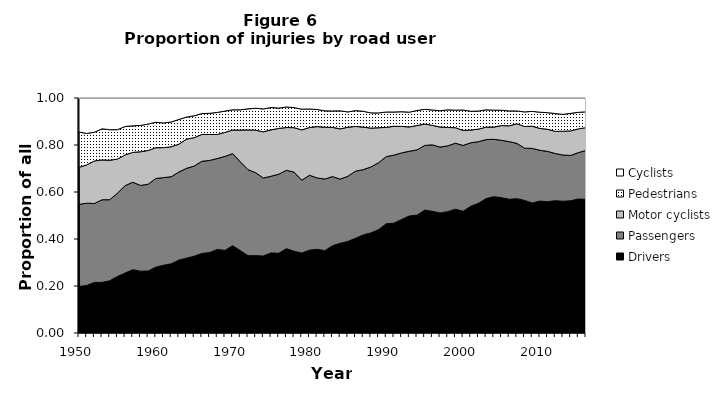
| Category | Drivers | Passengers | Motor cyclists | Pedestrians | Cyclists |
|---|---|---|---|---|---|
| 1950.0 | 0.198 | 0.349 | 0.158 | 0.15 | 0.145 |
| 1951.0 | 0.202 | 0.35 | 0.163 | 0.134 | 0.151 |
| 1952.0 | 0.215 | 0.336 | 0.181 | 0.122 | 0.146 |
| 1953.0 | 0.215 | 0.352 | 0.169 | 0.133 | 0.131 |
| 1954.0 | 0.222 | 0.345 | 0.168 | 0.13 | 0.135 |
| 1955.0 | 0.24 | 0.355 | 0.145 | 0.125 | 0.135 |
| 1956.0 | 0.255 | 0.372 | 0.131 | 0.121 | 0.121 |
| 1957.0 | 0.269 | 0.372 | 0.127 | 0.113 | 0.118 |
| 1958.0 | 0.263 | 0.365 | 0.143 | 0.112 | 0.117 |
| 1959.0 | 0.264 | 0.369 | 0.143 | 0.113 | 0.111 |
| 1960.0 | 0.28 | 0.377 | 0.131 | 0.108 | 0.103 |
| 1961.0 | 0.288 | 0.373 | 0.128 | 0.105 | 0.106 |
| 1962.0 | 0.294 | 0.371 | 0.127 | 0.105 | 0.102 |
| 1963.0 | 0.31 | 0.375 | 0.119 | 0.105 | 0.091 |
| 1964.0 | 0.318 | 0.382 | 0.124 | 0.094 | 0.081 |
| 1965.0 | 0.327 | 0.384 | 0.121 | 0.093 | 0.076 |
| 1966.0 | 0.339 | 0.392 | 0.114 | 0.089 | 0.066 |
| 1967.0 | 0.342 | 0.392 | 0.11 | 0.09 | 0.065 |
| 1968.0 | 0.356 | 0.387 | 0.102 | 0.094 | 0.061 |
| 1969.0 | 0.351 | 0.4 | 0.102 | 0.091 | 0.056 |
| 1970.0 | 0.372 | 0.392 | 0.1 | 0.086 | 0.05 |
| 1971.0 | 0.351 | 0.378 | 0.135 | 0.086 | 0.05 |
| 1972.0 | 0.329 | 0.366 | 0.169 | 0.09 | 0.046 |
| 1973.0 | 0.329 | 0.353 | 0.181 | 0.093 | 0.044 |
| 1974.0 | 0.328 | 0.332 | 0.197 | 0.097 | 0.047 |
| 1975.0 | 0.341 | 0.326 | 0.197 | 0.095 | 0.041 |
| 1976.0 | 0.339 | 0.336 | 0.195 | 0.086 | 0.043 |
| 1977.0 | 0.359 | 0.334 | 0.182 | 0.087 | 0.038 |
| 1978.0 | 0.348 | 0.337 | 0.189 | 0.085 | 0.041 |
| 1979.0 | 0.34 | 0.31 | 0.214 | 0.088 | 0.047 |
| 1980.0 | 0.353 | 0.319 | 0.203 | 0.079 | 0.047 |
| 1981.0 | 0.356 | 0.304 | 0.218 | 0.073 | 0.049 |
| 1982.0 | 0.35 | 0.305 | 0.22 | 0.07 | 0.055 |
| 1983.0 | 0.371 | 0.294 | 0.209 | 0.07 | 0.055 |
| 1984.0 | 0.382 | 0.273 | 0.214 | 0.077 | 0.055 |
| 1985.0 | 0.39 | 0.277 | 0.209 | 0.065 | 0.059 |
| 1986.0 | 0.403 | 0.285 | 0.191 | 0.067 | 0.054 |
| 1987.0 | 0.417 | 0.278 | 0.181 | 0.067 | 0.057 |
| 1988.0 | 0.426 | 0.281 | 0.165 | 0.065 | 0.063 |
| 1989.0 | 0.44 | 0.285 | 0.149 | 0.063 | 0.064 |
| 1990.0 | 0.465 | 0.285 | 0.124 | 0.066 | 0.059 |
| 1991.0 | 0.467 | 0.29 | 0.123 | 0.061 | 0.06 |
| 1992.0 | 0.483 | 0.283 | 0.113 | 0.062 | 0.058 |
| 1993.0 | 0.498 | 0.276 | 0.103 | 0.063 | 0.06 |
| 1994.0 | 0.502 | 0.278 | 0.104 | 0.064 | 0.053 |
| 1995.0 | 0.523 | 0.275 | 0.091 | 0.062 | 0.048 |
| 1996.0 | 0.518 | 0.283 | 0.083 | 0.066 | 0.051 |
| 1997.0 | 0.511 | 0.28 | 0.085 | 0.069 | 0.054 |
| 1998.0 | 0.516 | 0.28 | 0.078 | 0.075 | 0.05 |
| 1999.0 | 0.527 | 0.281 | 0.066 | 0.075 | 0.052 |
| 2000.0 | 0.518 | 0.28 | 0.064 | 0.087 | 0.051 |
| 2001.0 | 0.539 | 0.27 | 0.054 | 0.08 | 0.056 |
| 2002.0 | 0.552 | 0.262 | 0.054 | 0.077 | 0.056 |
| 2003.0 | 0.572 | 0.251 | 0.053 | 0.074 | 0.05 |
| 2004.0 | 0.58 | 0.244 | 0.052 | 0.072 | 0.052 |
| 2005.0 | 0.576 | 0.244 | 0.063 | 0.065 | 0.052 |
| 2006.0 | 0.569 | 0.245 | 0.067 | 0.063 | 0.055 |
| 2007.0 | 0.572 | 0.235 | 0.084 | 0.054 | 0.055 |
| 2008.0 | 0.564 | 0.222 | 0.092 | 0.062 | 0.059 |
| 2009.0 | 0.553 | 0.232 | 0.094 | 0.063 | 0.057 |
| 2010.0 | 0.561 | 0.216 | 0.093 | 0.069 | 0.06 |
| 2011.0 | 0.559 | 0.214 | 0.094 | 0.071 | 0.063 |
| 2012.0 | 0.563 | 0.201 | 0.094 | 0.076 | 0.066 |
| 2013.0 | 0.56 | 0.197 | 0.101 | 0.072 | 0.07 |
| 2014.0 | 0.563 | 0.193 | 0.104 | 0.075 | 0.065 |
| 2015.0 | 0.57 | 0.197 | 0.101 | 0.071 | 0.061 |
| 2016.0 | 0.569 | 0.208 | 0.097 | 0.067 | 0.059 |